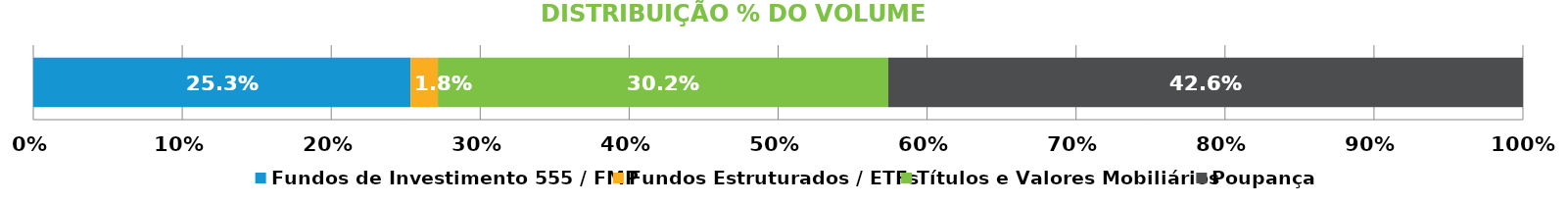
| Category | Fundos de Investimento 555 / FMP | Fundos Estruturados / ETFs | Títulos e Valores Mobiliários | Poupança |
|---|---|---|---|---|
| 0 | 0.253 | 0.018 | 0.302 | 0.426 |